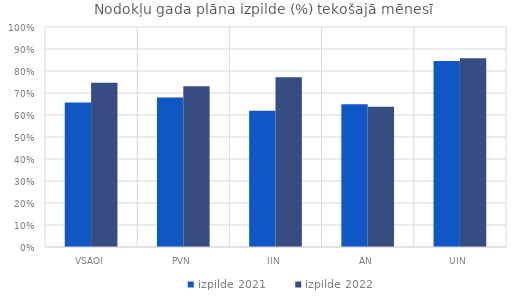
| Category | izpilde 2021 | izpilde 2022 |
|---|---|---|
| VSAOI | 0.657 | 0.747 |
| PVN | 0.68 | 0.73 |
| IIN | 0.619 | 0.772 |
| AN | 0.649 | 0.638 |
| UIN | 0.846 | 0.858 |